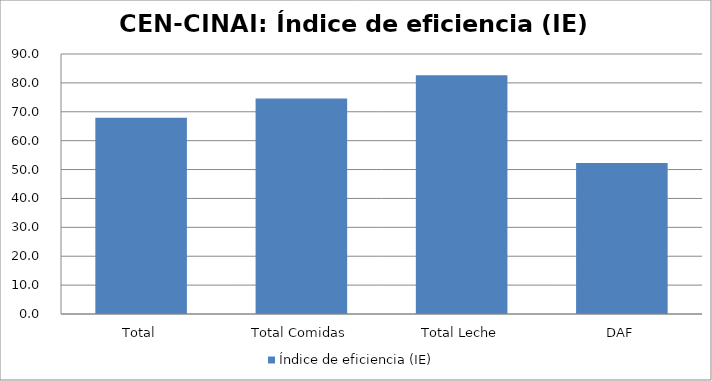
| Category | Índice de eficiencia (IE)  |
|---|---|
| Total | 67.952 |
| Total Comidas | 74.582 |
| Total Leche | 82.687 |
| DAF | 52.267 |